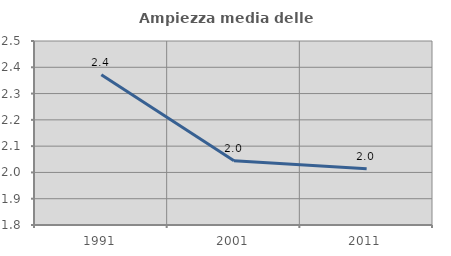
| Category | Ampiezza media delle famiglie |
|---|---|
| 1991.0 | 2.371 |
| 2001.0 | 2.044 |
| 2011.0 | 2.014 |